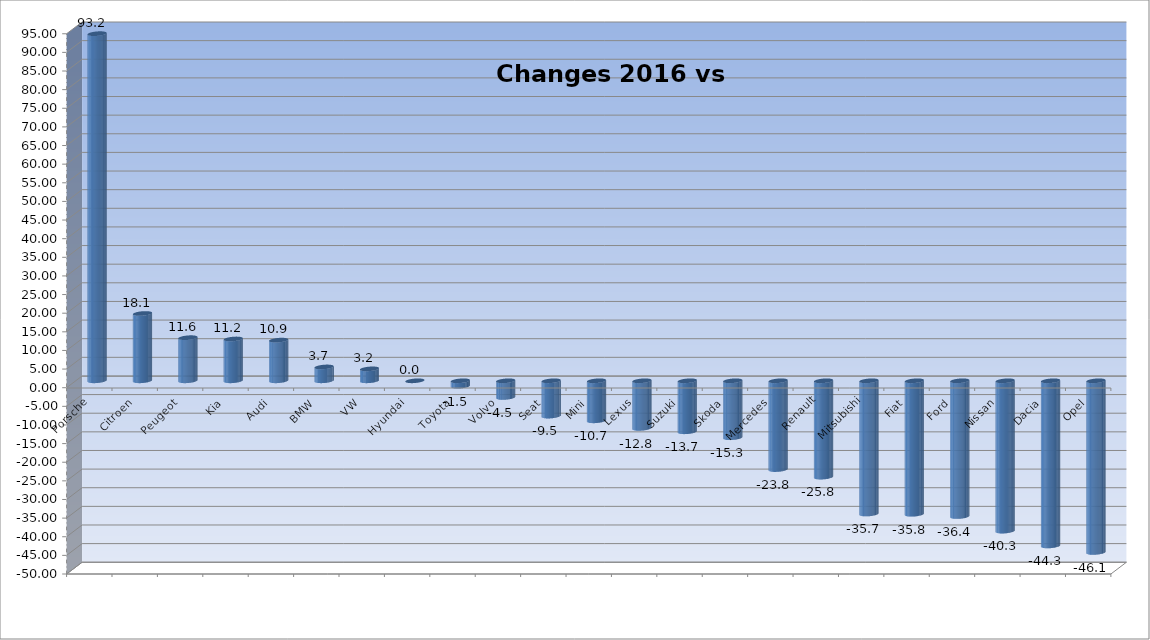
| Category | Ytd 2015 |
|---|---|
| Porsche | 93.168 |
| Citroen | 18.065 |
| Peugeot | 11.57 |
| Kia | 11.225 |
| Audi | 10.912 |
| BMW | 3.715 |
| VW | 3.202 |
| Hyundai | 0 |
| Toyota | -1.453 |
| Volvo | -4.466 |
| Seat | -9.474 |
| Mini | -10.736 |
| Lexus | -12.766 |
| Suzuki | -13.684 |
| Skoda | -15.271 |
| Mercedes | -23.823 |
| Renault | -25.847 |
| Mitsubishi | -35.749 |
| Fiat | -35.814 |
| Ford | -36.423 |
| Nissan | -40.348 |
| Dacia | -44.311 |
| Opel | -46.067 |